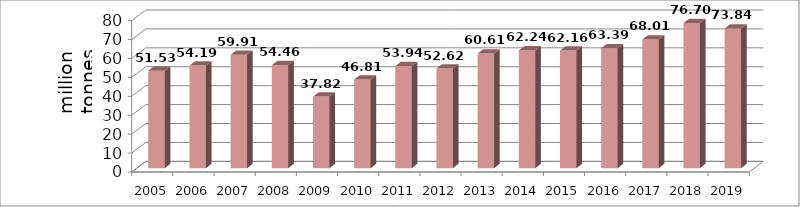
| Category | Series 1 |
|---|---|
| 2005.0 | 51.53 |
| 2006.0 | 54.19 |
| 2007.0 | 59.91 |
| 2008.0 | 54.46 |
| 2009.0 | 37.82 |
| 2010.0 | 46.81 |
| 2011.0 | 53.94 |
| 2012.0 | 52.62 |
| 2013.0 | 60.61 |
| 2014.0 | 62.24 |
| 2015.0 | 62.16 |
| 2016.0 | 63.388 |
| 2017.0 | 68.01 |
| 2018.0 | 76.7 |
| 2019.0 | 73.835 |